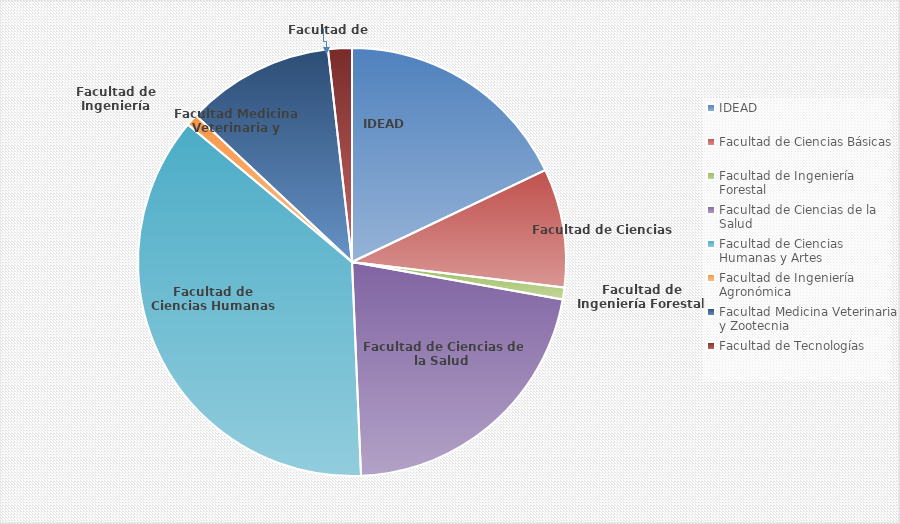
| Category | MATERIAL BIBLIOGRÁFICO INGRESADO 2019 |
|---|---|
| IDEAD | 1742880 |
| Facultad de Ciencias Básicas | 9467658 |
| Facultad de Ingeniería Forestal | 538500 |
| Facultad de Ciencias de la Salud  | 7062400 |
| Facultad de Ciencias Humanas y Artes | 6210398 |
| Facultad de Ingeniería Agronómica | 723200 |
| Facultad Medicina Veterinaria y Zootecnia | 6052840 |
| Facultad de Tecnologías | 436000 |